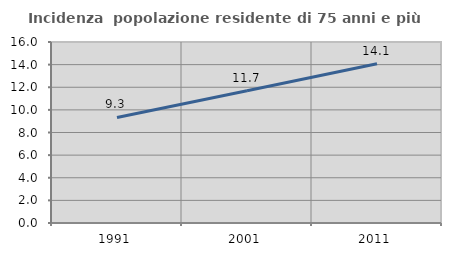
| Category | Incidenza  popolazione residente di 75 anni e più |
|---|---|
| 1991.0 | 9.334 |
| 2001.0 | 11.696 |
| 2011.0 | 14.076 |